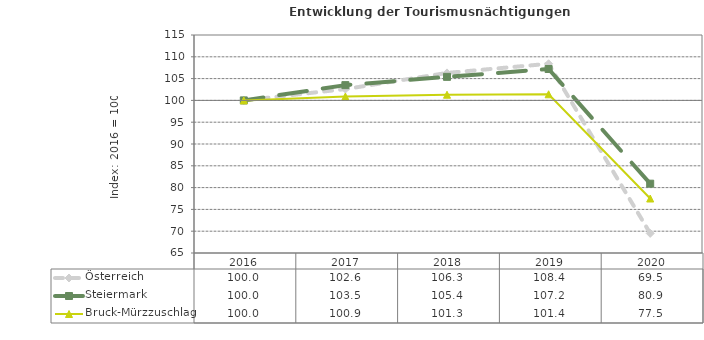
| Category | Österreich | Steiermark | Bruck-Mürzzuschlag |
|---|---|---|---|
| 2020.0 | 69.5 | 80.9 | 77.5 |
| 2019.0 | 108.4 | 107.2 | 101.4 |
| 2018.0 | 106.3 | 105.4 | 101.3 |
| 2017.0 | 102.6 | 103.5 | 100.9 |
| 2016.0 | 100 | 100 | 100 |